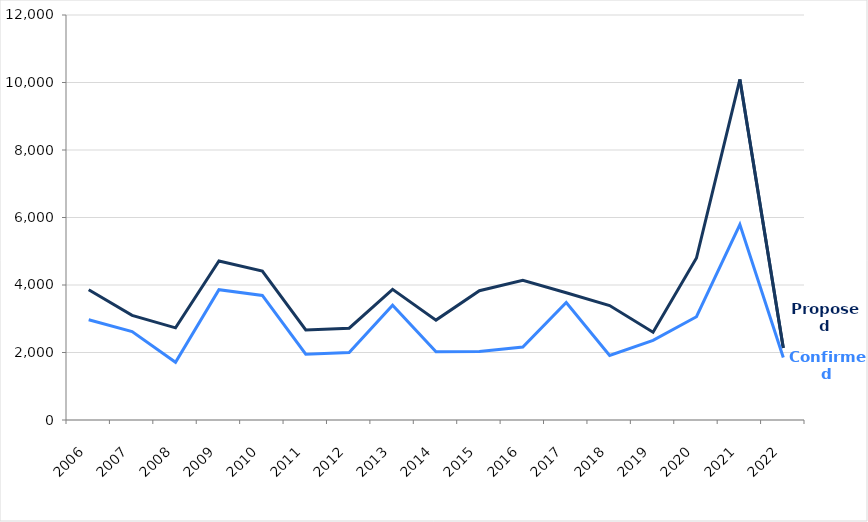
| Category | Proposed | Confirmed |
|---|---|---|
| 2006 | 3860 | 2970 |
| 2007 | 3100 | 2620 |
| 2008 | 2730 | 1710 |
| 2009 | 4710 | 3860 |
| 2010 | 4410 | 3690 |
| 2011 | 2670 | 1950 |
| 2012 | 2720 | 2000 |
| 2013 | 3870 | 3400 |
| 2014 | 2960 | 2020 |
| 2015 | 3830 | 2030 |
| 2016 | 4140 | 2160 |
| 2017 | 3770 | 3480 |
| 2018 | 3390 | 1910 |
| 2019 | 2600 | 2360 |
| 2020 | 4800 | 3060 |
| 2021 | 10090 | 5790 |
| 2022 | 2130 | 1850 |